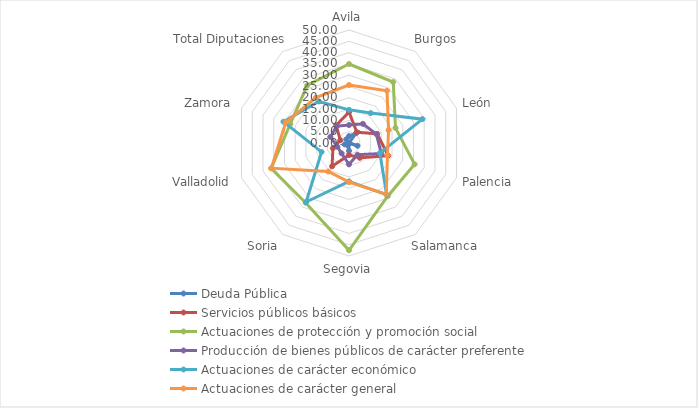
| Category | Deuda Pública | Servicios públicos básicos | Actuaciones de protección y promoción social | Producción de bienes públicos de carácter preferente | Actuaciones de carácter económico | Actuaciones de carácter general |
|---|---|---|---|---|---|---|
| Avila | 3.039 | 13.696 | 34.96 | 7.947 | 14.674 | 25.683 |
| Burgos | 5.365 | 5.908 | 33.31 | 10.476 | 16.357 | 28.584 |
| León | 0 | 13.111 | 21.626 | 12.703 | 34.148 | 18.411 |
| Palencia | 3.965 | 18.219 | 30.527 | 15.044 | 14.356 | 17.89 |
| Salamanca | 0 | 8.119 | 29.115 | 6.397 | 28.345 | 28.024 |
| Segovia | 3.489 | 5.313 | 47.456 | 9.46 | 16.96 | 17.322 |
| Soria | 1.111 | 12.749 | 32.66 | 5.627 | 32.259 | 15.593 |
| Valladolid | 2 | 7.478 | 36.224 | 5.413 | 12.772 | 36.113 |
| Zamora | 0.094 | 4.037 | 27.304 | 8.63 | 30.495 | 29.441 |
| Total Diputaciones | 2.002 | 9.664 | 31.485 | 9.215 | 22.734 | 24.9 |